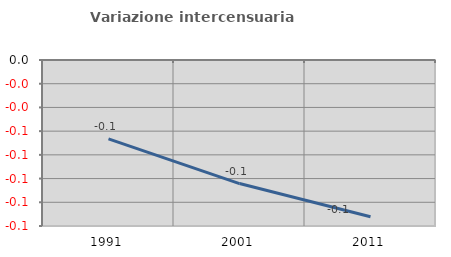
| Category | Variazione intercensuaria annua |
|---|---|
| 1991.0 | -0.067 |
| 2001.0 | -0.104 |
| 2011.0 | -0.132 |